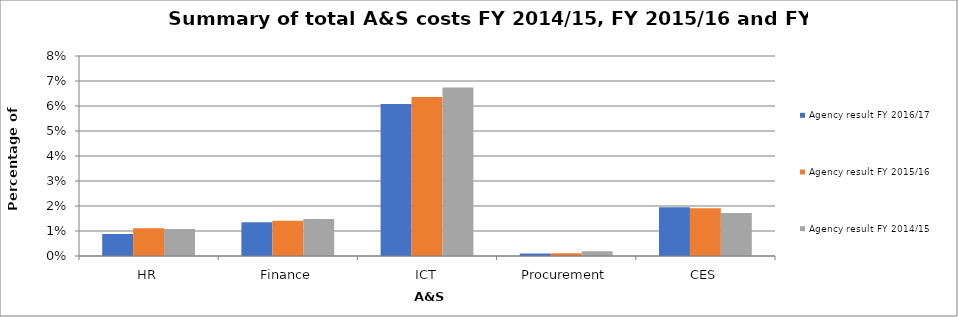
| Category | Agency result FY 2016/17 | Agency result FY 2015/16 | Agency result FY 2014/15 |
|---|---|---|---|
| HR | 0.009 | 0.011 | 0.011 |
| Finance | 0.014 | 0.014 | 0.015 |
| ICT | 0.061 | 0.064 | 0.067 |
| Procurement | 0.001 | 0.001 | 0.002 |
| CES | 0.02 | 0.019 | 0.017 |